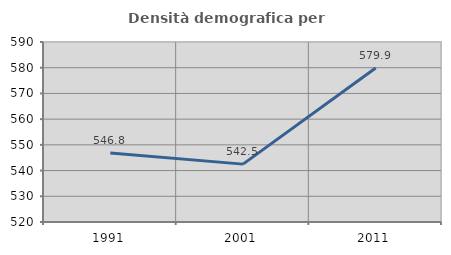
| Category | Densità demografica |
|---|---|
| 1991.0 | 546.801 |
| 2001.0 | 542.506 |
| 2011.0 | 579.871 |